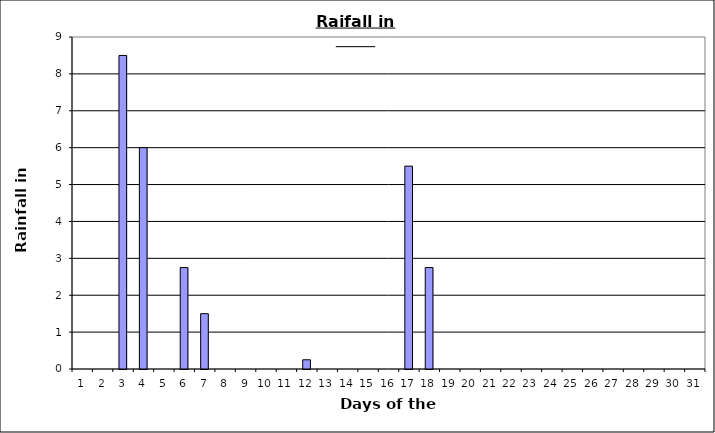
| Category | Series 0 |
|---|---|
| 0 | 0 |
| 1 | 0 |
| 2 | 8.5 |
| 3 | 6 |
| 4 | 0 |
| 5 | 2.75 |
| 6 | 1.5 |
| 7 | 0 |
| 8 | 0 |
| 9 | 0 |
| 10 | 0 |
| 11 | 0.25 |
| 12 | 0 |
| 13 | 0 |
| 14 | 0 |
| 15 | 0 |
| 16 | 5.5 |
| 17 | 2.75 |
| 18 | 0 |
| 19 | 0 |
| 20 | 0 |
| 21 | 0 |
| 22 | 0 |
| 23 | 0 |
| 24 | 0 |
| 25 | 0 |
| 26 | 0 |
| 27 | 0 |
| 28 | 0 |
| 29 | 0 |
| 30 | 0 |